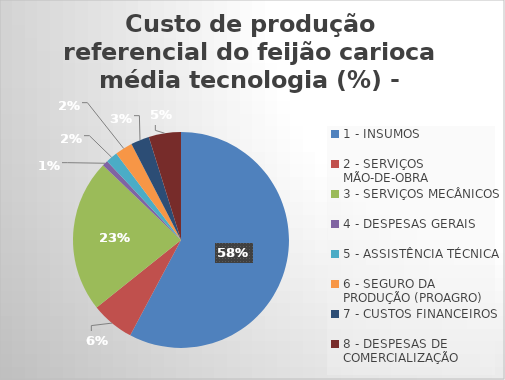
| Category | Series 0 |
|---|---|
| 1 - INSUMOS | 57.785 |
| 2 - SERVIÇOS MÃO-DE-OBRA | 6.484 |
| 3 - SERVIÇOS MECÂNICOS | 22.874 |
| 4 - DESPESAS GERAIS  | 0.871 |
| 5 - ASSISTÊNCIA TÉCNICA | 1.76 |
| 6 - SEGURO DA PRODUÇÃO (PROAGRO) | 2.64 |
| 7 - CUSTOS FINANCEIROS | 2.772 |
| 8 - DESPESAS DE COMERCIALIZAÇÃO | 4.813 |